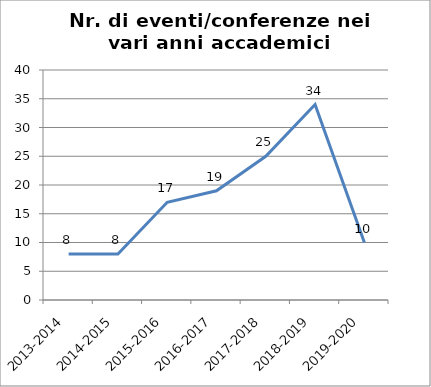
| Category | Nr. Eventi/Conferenze |
|---|---|
| 2013-2014 | 8 |
| 2014-2015 | 8 |
| 2015-2016 | 17 |
| 2016-2017 | 19 |
| 2017-2018 | 25 |
| 2018-2019 | 34 |
| 2019-2020 | 10 |